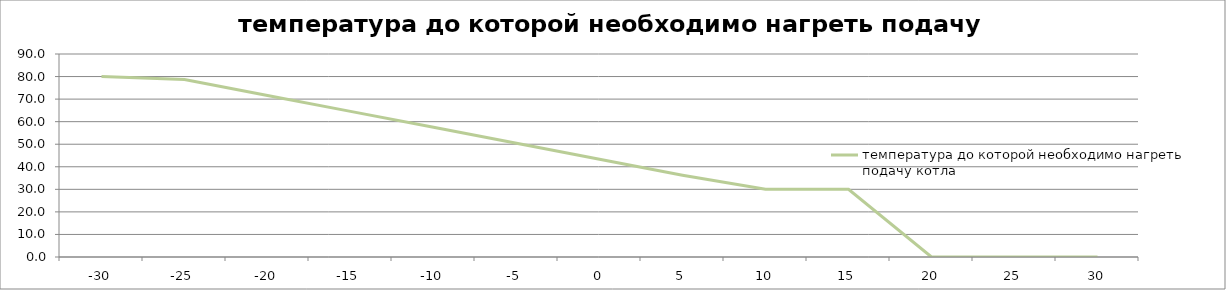
| Category | температура до которой необходимо нагреть подачу котла |
|---|---|
| -30.0 | 80 |
| -25.0 | 78.711 |
| -20.0 | 71.64 |
| -15.0 | 64.569 |
| -10.0 | 57.497 |
| -5.0 | 50.426 |
| 0.0 | 43.355 |
| 5.0 | 36.284 |
| 10.0 | 30 |
| 15.0 | 30 |
| 20.0 | 0 |
| 25.0 | 0 |
| 30.0 | 0 |